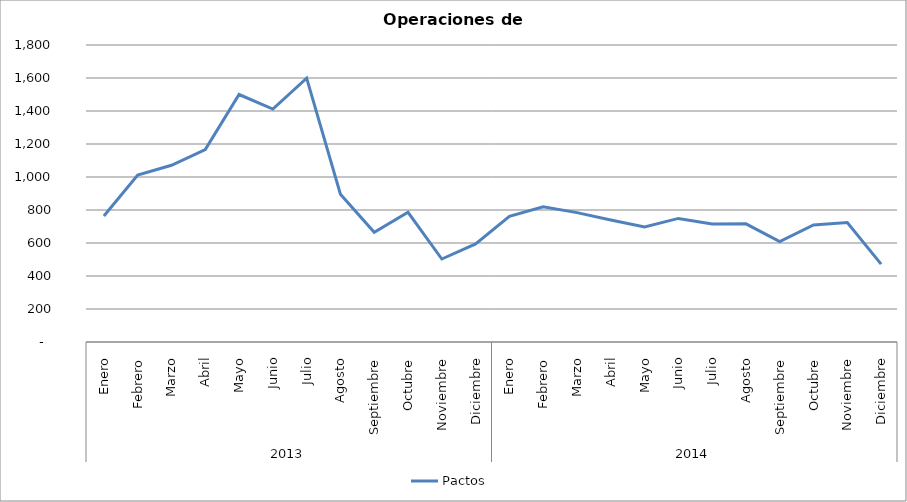
| Category | Pactos |
|---|---|
| 0 | 764 |
| 1 | 1012 |
| 2 | 1071 |
| 3 | 1166 |
| 4 | 1500 |
| 5 | 1412 |
| 6 | 1599 |
| 7 | 896 |
| 8 | 665 |
| 9 | 786 |
| 10 | 503 |
| 11 | 594 |
| 12 | 762 |
| 13 | 819 |
| 14 | 784 |
| 15 | 739 |
| 16 | 697 |
| 17 | 749 |
| 18 | 715 |
| 19 | 716 |
| 20 | 609 |
| 21 | 709 |
| 22 | 724 |
| 23 | 472 |